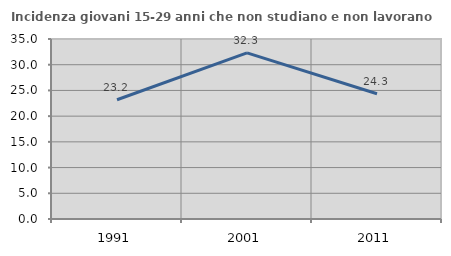
| Category | Incidenza giovani 15-29 anni che non studiano e non lavorano  |
|---|---|
| 1991.0 | 23.184 |
| 2001.0 | 32.292 |
| 2011.0 | 24.348 |